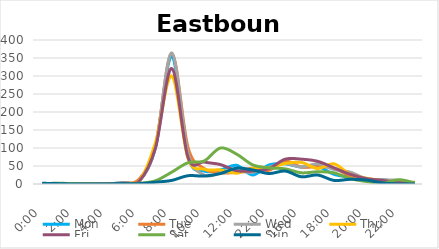
| Category | Mon | Tue | Wed | Thu | Fri | Sat | Sun |
|---|---|---|---|---|---|---|---|
| 0.0 | 0 | 1 | 0 | 0 | 0 | 1 | 2 |
| 0.041667 | 0 | 0 | 1 | 0 | 1 | 2 | 1 |
| 0.083333 | 0 | 0 | 0 | 1 | 0 | 1 | 0 |
| 0.125 | 0 | 0 | 0 | 0 | 0 | 0 | 0 |
| 0.166667 | 0 | 0 | 0 | 0 | 1 | 0 | 0 |
| 0.208333 | 4 | 3 | 4 | 1 | 2 | 0 | 1 |
| 0.25 | 10 | 14 | 8 | 9 | 8 | 2 | 1 |
| 0.291667 | 102 | 107 | 105 | 116 | 101 | 9 | 5 |
| 0.333333 | 354 | 363 | 364 | 300 | 321 | 33 | 10 |
| 0.375 | 76 | 102 | 87 | 72 | 74 | 59 | 23 |
| 0.416667 | 36 | 43 | 25 | 41 | 61 | 64 | 22 |
| 0.458333 | 39 | 31 | 30 | 39 | 54 | 100 | 29 |
| 0.5 | 52 | 33 | 35 | 30 | 37 | 83 | 44 |
| 0.541667 | 25 | 44 | 33 | 43 | 36 | 53 | 39 |
| 1900-01-02 22:00:00 | 53 | 38 | 47 | 44 | 43 | 45 | 29 |
| 0.625 | 56 | 64 | 57 | 57 | 69 | 42 | 36 |
| 0.666667 | 47 | 47 | 47 | 60 | 69 | 31 | 20 |
| 0.708333 | 49 | 48 | 56 | 43 | 63 | 34 | 25 |
| 0.75 | 27 | 44 | 40 | 56 | 45 | 31 | 10 |
| 0.791667 | 19 | 22 | 33 | 27 | 27 | 15 | 13 |
| 0.833333 | 13 | 9 | 15 | 16 | 15 | 7 | 11 |
| 0.875 | 12 | 7 | 12 | 9 | 10 | 2 | 3 |
| 0.916667 | 3 | 2 | 10 | 4 | 4 | 12 | 0 |
| 0.958333 | 2 | 5 | 3 | 3 | 2 | 3 | 0 |